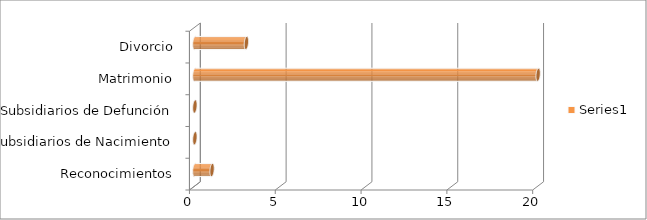
| Category | Series 0 |
|---|---|
| Reconocimientos | 1 |
| Subsidiarios de Nacimiento | 0 |
| Subsidiarios de Defunción | 0 |
| Matrimonio | 20 |
| Divorcio | 3 |